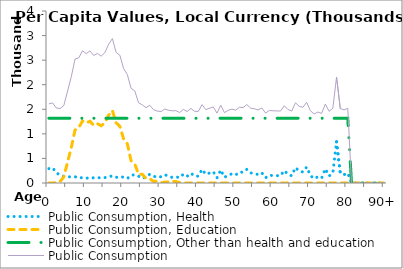
| Category | Public Consumption, Health | Public Consumption, Education | Public Consumption, Other than health and education | Public Consumption |
|---|---|---|---|---|
| 0 | 292.62 | 0 | 1317.29 | 1609.911 |
|  | 310.254 | 1.778 | 1317.29 | 1629.323 |
| 2 | 204.224 | 4.768 | 1317.29 | 1526.282 |
| 3 | 165.994 | 31.766 | 1317.29 | 1515.051 |
| 4 | 137.094 | 121.764 | 1317.29 | 1576.149 |
| 5 | 126.137 | 426.161 | 1317.29 | 1869.588 |
| 6 | 124.713 | 720.511 | 1317.29 | 2162.514 |
| 7 | 127.68 | 1077.294 | 1317.29 | 2522.265 |
| 8 | 102.075 | 1127.391 | 1317.29 | 2546.756 |
| 9 | 111.556 | 1261.438 | 1317.29 | 2690.284 |
| 10 | 94.696 | 1221.311 | 1317.29 | 2633.297 |
| 11 | 112.93 | 1257.412 | 1317.29 | 2687.632 |
| 12 | 103.768 | 1173.195 | 1317.29 | 2594.254 |
| 13 | 112.994 | 1206.911 | 1317.29 | 2637.195 |
| 14 | 100.19 | 1164.035 | 1317.29 | 2581.516 |
| 15 | 110.023 | 1227.362 | 1317.29 | 2654.675 |
| 16 | 125.949 | 1380.505 | 1317.29 | 2823.745 |
| 17 | 146.056 | 1475.23 | 1317.29 | 2938.576 |
| 18 | 114.206 | 1225.001 | 1317.29 | 2656.498 |
| 19 | 127.463 | 1154.855 | 1317.29 | 2599.608 |
| 20 | 117.857 | 895.127 | 1317.29 | 2330.274 |
| 21 | 90.25 | 798.604 | 1317.29 | 2206.145 |
| 22 | 156.324 | 453.412 | 1317.29 | 1927.026 |
| 23 | 169.422 | 386.741 | 1317.29 | 1873.454 |
| 24 | 139.151 | 176.224 | 1317.29 | 1632.666 |
| 25 | 96.552 | 177.204 | 1317.29 | 1591.046 |
| 26 | 119.449 | 94.67 | 1317.29 | 1531.409 |
| 27 | 177.538 | 88.472 | 1317.29 | 1583.3 |
| 28 | 141.129 | 32.849 | 1317.29 | 1491.268 |
| 29 | 112.785 | 35.218 | 1317.29 | 1465.294 |
| 30 | 128.158 | 6.653 | 1317.29 | 1452.102 |
| 31 | 168.791 | 18.633 | 1317.29 | 1504.714 |
| 32 | 140.617 | 23.113 | 1317.29 | 1481.02 |
| 33 | 113.426 | 37.822 | 1317.29 | 1468.539 |
| 34 | 125.62 | 28.797 | 1317.29 | 1471.708 |
| 35 | 108.91 | 7.983 | 1317.29 | 1434.183 |
| 36 | 179.732 | 0 | 1317.29 | 1497.022 |
| 37 | 136.439 | 0 | 1317.29 | 1453.729 |
| 38 | 200.17 | 0 | 1317.29 | 1517.46 |
| 39 | 141.895 | 0 | 1317.29 | 1459.185 |
| 40 | 138.944 | 0 | 1317.29 | 1456.235 |
| 41 | 277.7 | 0 | 1317.29 | 1594.99 |
| 42 | 176.086 | 0 | 1317.29 | 1493.376 |
| 43 | 203.579 | 0 | 1317.29 | 1520.869 |
| 44 | 230.514 | 0 | 1317.29 | 1547.805 |
| 45 | 104.328 | 0 | 1317.29 | 1421.618 |
| 46 | 265.65 | 0 | 1317.29 | 1582.941 |
| 47 | 114.61 | 0 | 1317.29 | 1431.9 |
| 48 | 161.471 | 0 | 1317.29 | 1478.762 |
| 49 | 185.875 | 0 | 1317.29 | 1503.165 |
| 50 | 162.702 | 0 | 1317.29 | 1479.992 |
| 51 | 225.54 | 0 | 1317.29 | 1542.831 |
| 52 | 217.396 | 0 | 1317.29 | 1534.686 |
| 53 | 278.967 | 0 | 1317.29 | 1596.257 |
| 54 | 205.784 | 0 | 1317.29 | 1523.075 |
| 55 | 192.495 | 0 | 1317.29 | 1509.786 |
| 56 | 171.623 | 0 | 1317.29 | 1488.914 |
| 57 | 208.202 | 0 | 1317.29 | 1525.492 |
| 58 | 106.463 | 0 | 1317.29 | 1423.753 |
| 59 | 158.224 | 0 | 1317.29 | 1475.515 |
| 60 | 152.089 | 0 | 1317.29 | 1469.379 |
| 61 | 149.5 | 0 | 1317.29 | 1466.79 |
| 62 | 148.279 | 0 | 1317.29 | 1465.569 |
| 63 | 254.337 | 0 | 1317.29 | 1571.627 |
| 64 | 176.624 | 0 | 1317.29 | 1493.914 |
| 65 | 146.657 | 0 | 1317.29 | 1463.948 |
| 66 | 314.815 | 0 | 1317.29 | 1632.105 |
| 67 | 242.898 | 0 | 1317.29 | 1560.188 |
| 68 | 223.399 | 0 | 1317.29 | 1540.69 |
| 69 | 324.83 | 0 | 1317.29 | 1642.12 |
| 70 | 151.813 | 0 | 1317.29 | 1469.104 |
| 71 | 87.584 | 0 | 1317.29 | 1404.875 |
| 72 | 126.358 | 0 | 1317.29 | 1443.649 |
| 73 | 98.656 | 0 | 1317.29 | 1415.946 |
| 74 | 288.903 | 0 | 1317.29 | 1606.193 |
| 75 | 141.955 | 0 | 1317.29 | 1459.245 |
| 76 | 203.966 | 0 | 1317.29 | 1521.257 |
| 77 | 838.041 | 0 | 1317.29 | 2155.331 |
| 78 | 197.333 | 0 | 1317.29 | 1514.623 |
| 79 | 170.801 | 0 | 1317.29 | 1488.091 |
| 80 | 201.841 | 0 | 1317.29 | 1519.131 |
| 81 | 0 | 0 | 0 | 0 |
| 82 | 0 | 0 | 0 | 0 |
| 83 | 0 | 0 | 0 | 0 |
| 84 | 0 | 0 | 0 | 0 |
| 85 | 0 | 0 | 0 | 0 |
| 86 | 0 | 0 | 0 | 0 |
| 87 | 0 | 0 | 0 | 0 |
| 88 | 0 | 0 | 0 | 0 |
| 89 | 0 | 0 | 0 | 0 |
| 90+ | 0 | 0 | 0 | 0 |